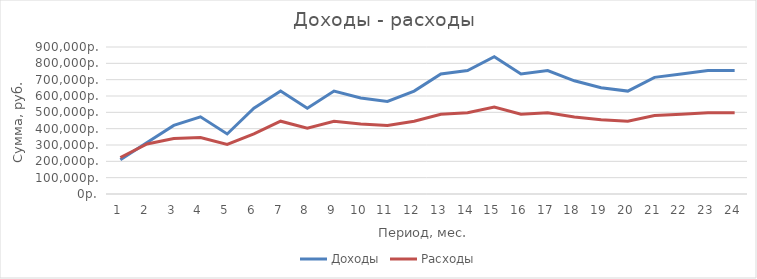
| Category | Доходы | Расходы |
|---|---|---|
| 0 | 210030 | 223445.633 |
| 1 | 315045 | 306501.783 |
| 2 | 420060 | 339557.933 |
| 3 | 472567.5 | 346086.008 |
| 4 | 367552.5 | 303029.858 |
| 5 | 525075 | 367614.083 |
| 6 | 630090 | 445670.233 |
| 7 | 525075 | 402614.083 |
| 8 | 630090 | 445670.233 |
| 9 | 588084 | 428447.773 |
| 10 | 567081 | 419836.543 |
| 11 | 630090 | 445670.233 |
| 12 | 735105 | 488726.383 |
| 13 | 756108 | 497337.613 |
| 14 | 840120 | 531782.533 |
| 15 | 735105 | 488726.383 |
| 16 | 756108 | 497337.613 |
| 17 | 693099 | 471503.923 |
| 18 | 651093 | 454281.463 |
| 19 | 630090 | 445670.233 |
| 20 | 714102 | 480115.153 |
| 21 | 735105 | 488726.383 |
| 22 | 756108 | 497337.613 |
| 23 | 756108 | 497337.613 |